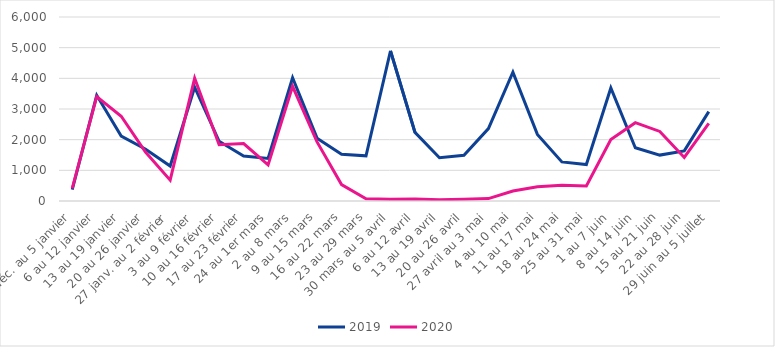
| Category | 2019 | 2020 |
|---|---|---|
| 30 déc. au 5 janvier | 369 | 411 |
| 6 au 12 janvier | 3446 | 3402 |
| 13 au 19 janvier | 2117 | 2765 |
| 20 au 26 janvier | 1689 | 1587 |
| 27 janv. au 2 février | 1140 | 678 |
| 3 au 9 février | 3711 | 4002 |
| 10 au 16 février | 1947 | 1835 |
| 17 au 23 février | 1464 | 1874 |
| 24 au 1er mars | 1389 | 1178 |
| 2 au 8 mars | 4019 | 3741 |
| 9 au 15 mars | 2049 | 1928 |
| 16 au 22 mars | 1525 | 536 |
| 23 au 29 mars | 1473 | 74 |
| 30 mars au 5 avril | 4896 | 61 |
| 6 au 12 avril | 2237 | 69 |
| 13 au 19 avril | 1410 | 40 |
| 20 au 26 avril | 1489 | 59 |
| 27 avril au 3 mai | 2361 | 79 |
| 4 au 10 mai | 4200 | 324 |
| 11 au 17 mai | 2172 | 463 |
| 18 au 24 mai | 1275 | 517 |
| 25 au 31 mai | 1190 | 489 |
| 1 au 7 juin | 3685 | 2004 |
| 8 au 14 juin | 1736 | 2555 |
| 15 au 21 juin | 1497 | 2269 |
| 22 au 28 juin | 1634 | 1420 |
| 29 juin au 5 juillet | 2913 | 2532 |